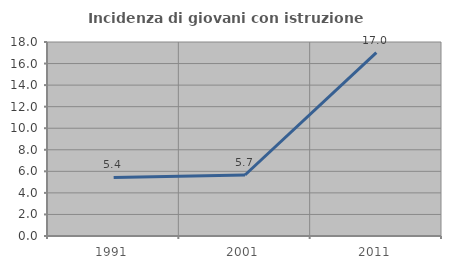
| Category | Incidenza di giovani con istruzione universitaria |
|---|---|
| 1991.0 | 5.435 |
| 2001.0 | 5.66 |
| 2011.0 | 17.021 |